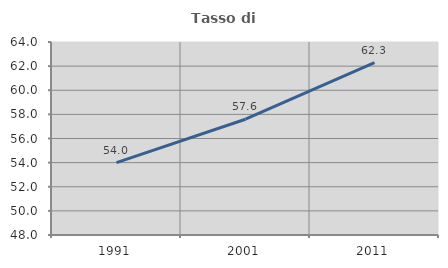
| Category | Tasso di occupazione   |
|---|---|
| 1991.0 | 54.006 |
| 2001.0 | 57.597 |
| 2011.0 | 62.289 |